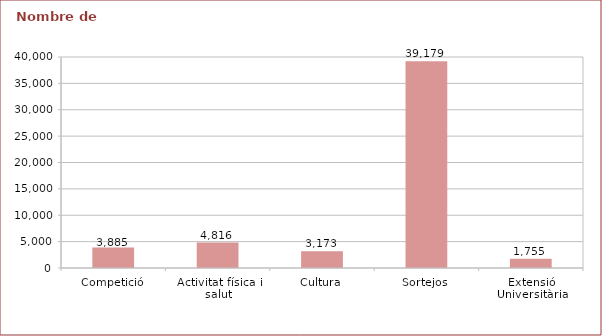
| Category | Series 0 |
|---|---|
| Competició | 3885 |
| Activitat física i salut | 4816 |
| Cultura | 3173 |
| Sortejos | 39179 |
| Extensió Universitària | 1755 |